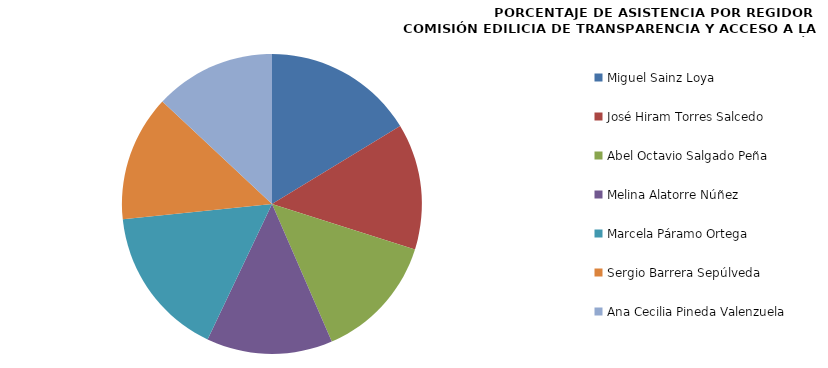
| Category | Series 0 |
|---|---|
| Miguel Sainz Loya | 100 |
| José Hiram Torres Salcedo | 83.333 |
| Abel Octavio Salgado Peña | 83.333 |
| Melina Alatorre Núñez | 83.333 |
| Marcela Páramo Ortega | 100 |
| Sergio Barrera Sepúlveda | 83.333 |
| Ana Cecilia Pineda Valenzuela | 80 |